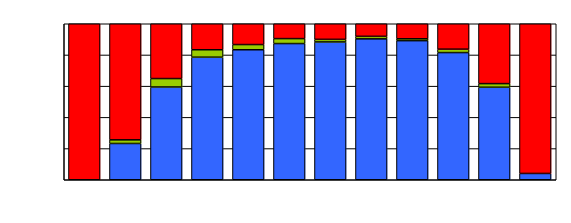
| Category | Series 0 | Series 1 | Series 2 |
|---|---|---|---|
| 0 | 0 | 0 | 130 |
| 1 | 10 | 1 | 32 |
| 2 | 22 | 2 | 13 |
| 3 | 33 | 2 | 7 |
| 4 | 50 | 2 | 8 |
| 5 | 55 | 2 | 6 |
| 6 | 53 | 1 | 6 |
| 7 | 56 | 1 | 5 |
| 8 | 74 | 1 | 8 |
| 9 | 75 | 2 | 15 |
| 10 | 51 | 2 | 33 |
| 11 | 12 | 0 | 286 |